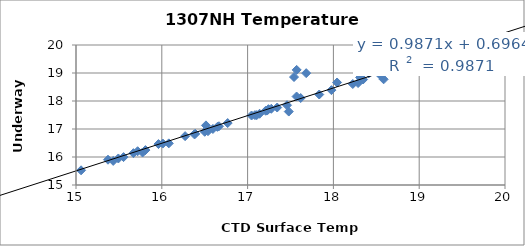
| Category | Series 0 |
|---|---|
| 21.2969 | 21.713 |
| 21.008850000000002 | 21.388 |
| 20.02385 | 20.464 |
| 19.8078 | 20.178 |
| 18.4129 | 18.988 |
| 18.550800000000002 | 18.91 |
| 18.2258 | 18.607 |
| 18.2876 | 18.641 |
| 17.4593 | 17.849 |
| 16.50045 | 16.901 |
| 17.045749999999998 | 17.482 |
| 17.22835 | 17.66 |
| 17.139249999999997 | 17.544 |
| 17.835050000000003 | 18.232 |
| 18.7284 | 19.122 |
| 18.34635 | 18.768 |
| 17.9769 | 18.388 |
| 17.08565 | 17.496 |
| 16.6665 | 17.098 |
| 16.379849999999998 | 16.809 |
| 16.595750000000002 | 17.002 |
| 17.4801 | 17.623 |
| 15.8093 | 16.247 |
| 16.08145 | 16.487 |
| 15.43345 | 15.86 |
| 16.7678 | 17.212 |
| 16.64815 | 17.077 |
| 17.10635 | 17.496 |
| 17.61875 | 18.106 |
| 17.34485 | 17.767 |
| 16.38995 | 16.829 |
| 16.271900000000002 | 16.745 |
| 15.96125 | 16.462 |
| 15.669550000000001 | 16.137 |
| 15.7761 | 16.16 |
| 17.2429 | 17.708 |
| 18.3114 | 18.843 |
| 17.541 | 18.856 |
| 17.6829 | 18.994 |
| 14.6939 | 15.218 |
| 12.8459 | 13.467 |
| 14.27515 | 14.772 |
| 15.3728 | 15.903 |
| 16.011850000000003 | 16.48 |
| 15.718250000000001 | 16.206 |
| 17.210749999999997 | 17.652 |
| 17.276049999999998 | 17.722 |
| 16.53805 | 16.922 |
| 15.554400000000001 | 15.997 |
| 15.49335 | 15.947 |
| 14.4507 | 14.94 |
| 14.0379 | 14.511 |
| 12.8721 | 13.327 |
| 11.9204 | 12.419 |
| 16.51465 | 17.129 |
| 15.05915 | 15.524 |
| 18.5856 | 18.775 |
| 19.134749999999997 | 19.526 |
| 18.8316 | 19.194 |
| 18.042949999999998 | 18.661 |
| 18.91075 | 19.395 |
| 19.3279 | 19.758 |
| 17.571649999999998 | 19.111 |
| 19.973 | 20.405 |
| 20.15475 | 20.209 |
| 20.0672 | 20.543 |
| 20.002450000000003 | 20.419 |
| 19.99325 | 20.417 |
| 17.570999999999998 | 18.16 |